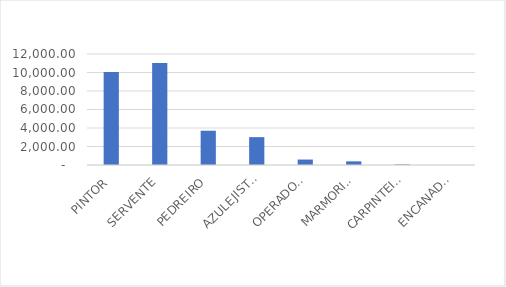
| Category | Series 0 |
|---|---|
| PINTOR | 10043.638 |
| SERVENTE | 11032.236 |
| PEDREIRO | 3705.859 |
| AZULEJISTA OU LADRILHISTA | 3011.219 |
| OPERADOR DE BETONEIRA ESTACIONARIA/MISTURADOR (COLETADO CAIXA)  | 590.653 |
| MARMORISTA / GRANITEIRO | 395.261 |
| CARPINTEIRO DE ESQUADRIAS | 65.245 |
| ENCANADOR OU BOMBEIRO          HIDRAULICO | 1.014 |